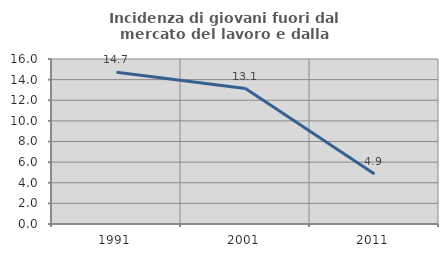
| Category | Incidenza di giovani fuori dal mercato del lavoro e dalla formazione  |
|---|---|
| 1991.0 | 14.706 |
| 2001.0 | 13.131 |
| 2011.0 | 4.854 |